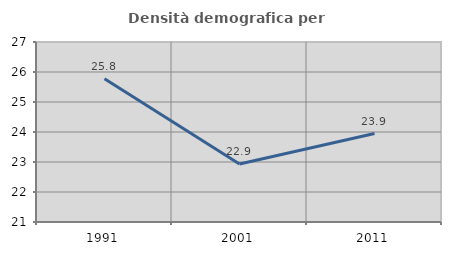
| Category | Densità demografica |
|---|---|
| 1991.0 | 25.776 |
| 2001.0 | 22.935 |
| 2011.0 | 23.95 |